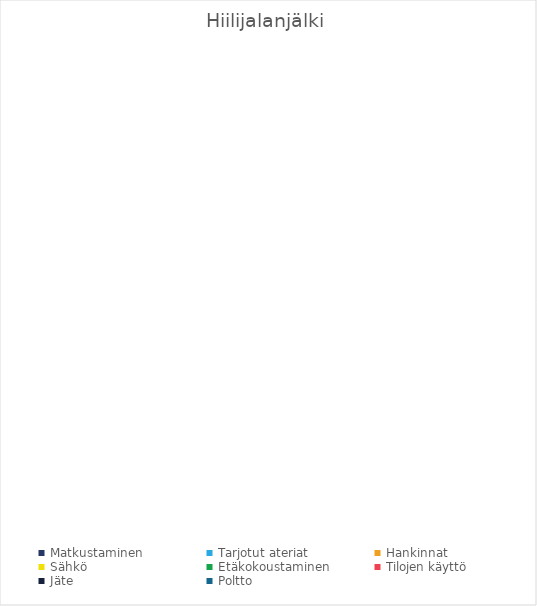
| Category | Hiilijalanjälki |
|---|---|
| Matkustaminen | 0 |
| Tarjotut ateriat | 0 |
| Hankinnat | 0 |
| Sähkö | 0 |
| Etäkokoustaminen | 0 |
| Tilojen käyttö | 0 |
| Jäte | 0 |
| Poltto | 0 |